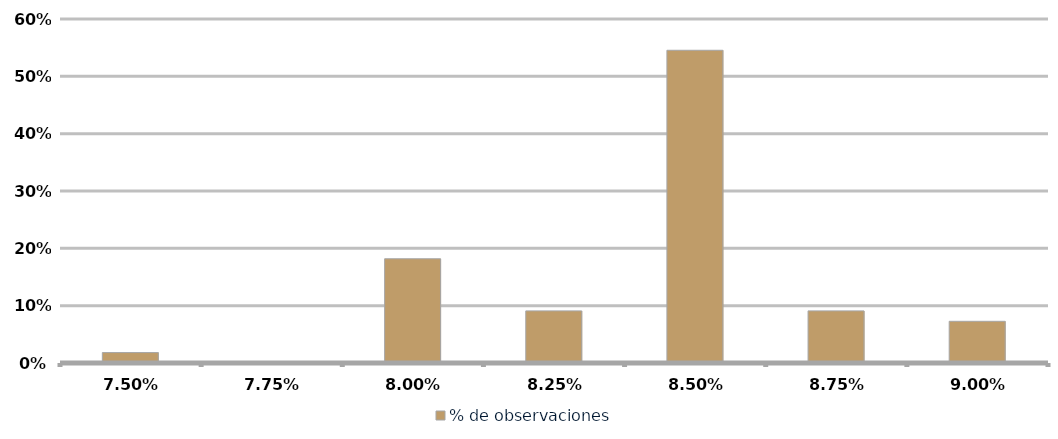
| Category | % de observaciones  |
|---|---|
| 0.075 | 0.018 |
| 0.0775 | 0 |
| 0.08 | 0.182 |
| 0.0825 | 0.091 |
| 0.085 | 0.545 |
| 0.08750000000000001 | 0.091 |
| 0.09000000000000001 | 0.073 |